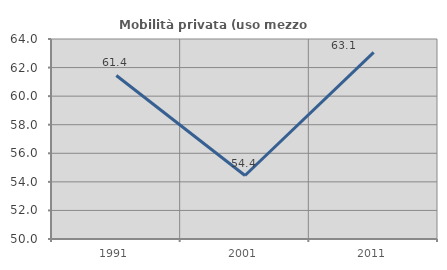
| Category | Mobilità privata (uso mezzo privato) |
|---|---|
| 1991.0 | 61.446 |
| 2001.0 | 54.444 |
| 2011.0 | 63.06 |